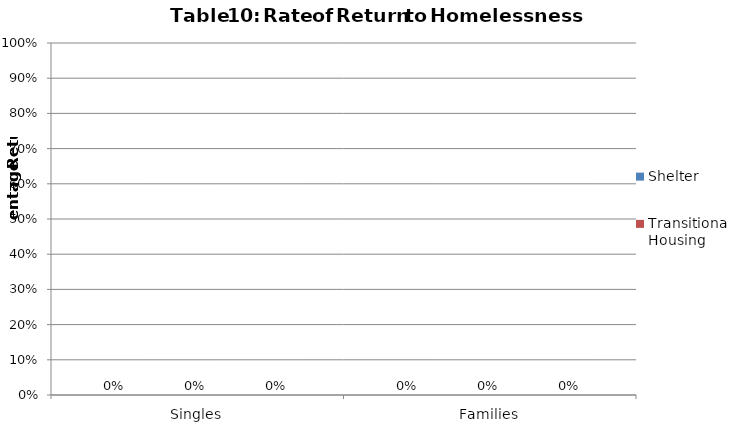
| Category | Shelter | Transitional Housing | Rapid Re-Housing |
|---|---|---|---|
| Singles | 0 | 0 | 0 |
| Families | 0 | 0 | 0 |